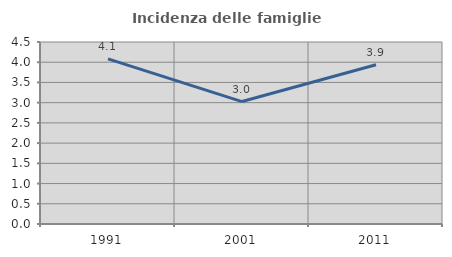
| Category | Incidenza delle famiglie numerose |
|---|---|
| 1991.0 | 4.084 |
| 2001.0 | 3.027 |
| 2011.0 | 3.938 |